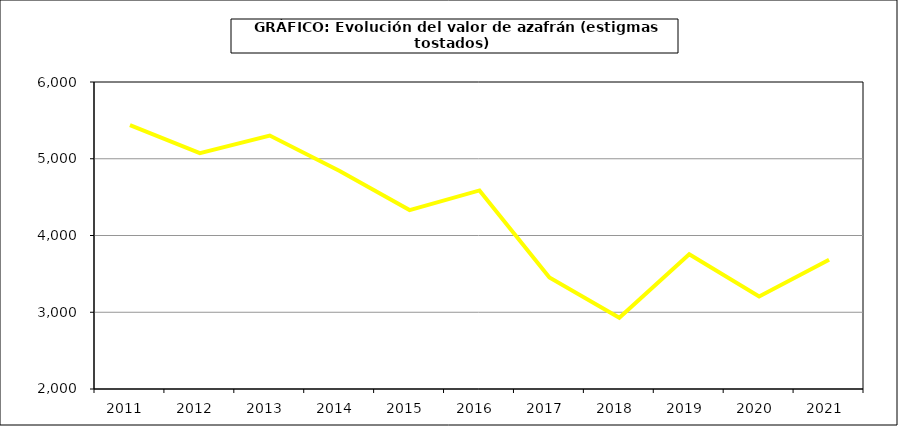
| Category | Valor |
|---|---|
| 2011.0 | 5438.177 |
| 2012.0 | 5071.99 |
| 2013.0 | 5302.253 |
| 2014.0 | 4841.325 |
| 2015.0 | 4331 |
| 2016.0 | 4587 |
| 2017.0 | 3451.991 |
| 2018.0 | 2929.42 |
| 2019.0 | 3756.782 |
| 2020.0 | 3205.777 |
| 2021.0 | 3683.282 |